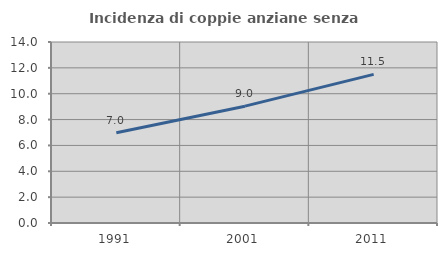
| Category | Incidenza di coppie anziane senza figli  |
|---|---|
| 1991.0 | 6.987 |
| 2001.0 | 9.037 |
| 2011.0 | 11.498 |